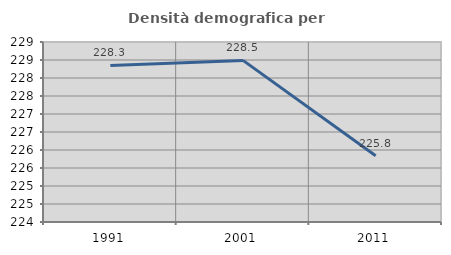
| Category | Densità demografica |
|---|---|
| 1991.0 | 228.35 |
| 2001.0 | 228.489 |
| 2011.0 | 225.841 |